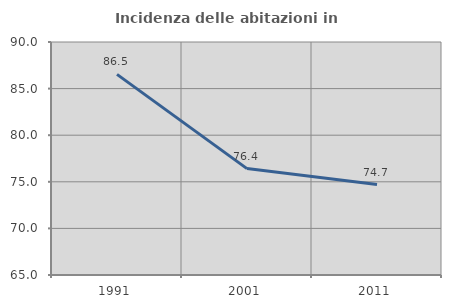
| Category | Incidenza delle abitazioni in proprietà  |
|---|---|
| 1991.0 | 86.525 |
| 2001.0 | 76.415 |
| 2011.0 | 74.699 |